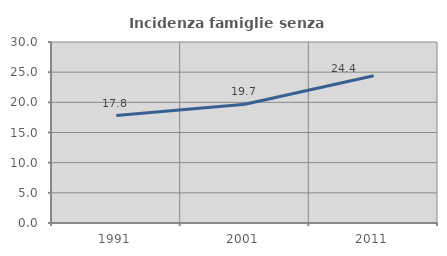
| Category | Incidenza famiglie senza nuclei |
|---|---|
| 1991.0 | 17.808 |
| 2001.0 | 19.687 |
| 2011.0 | 24.401 |